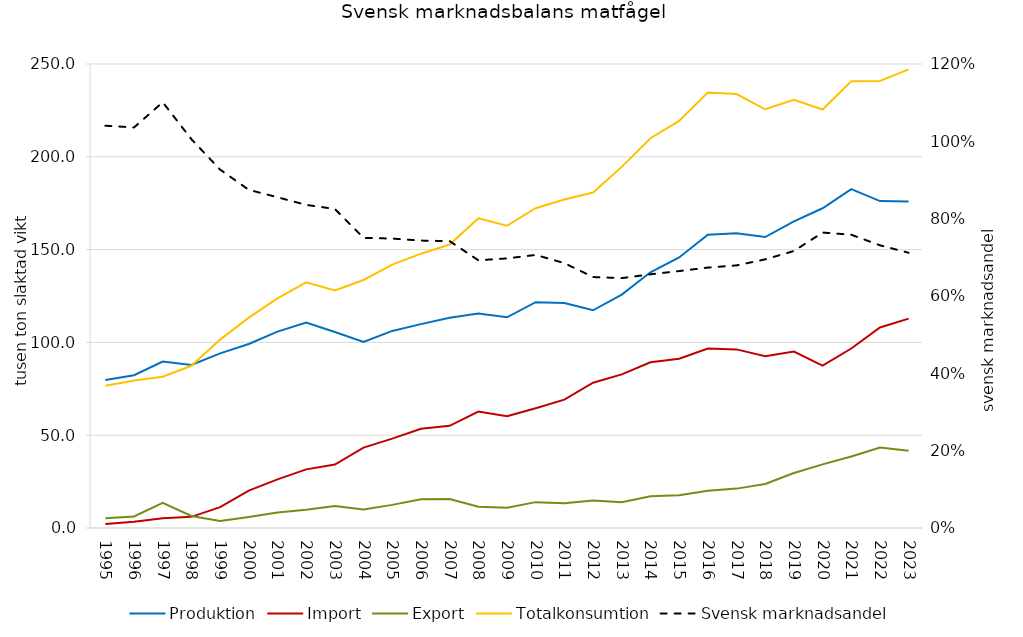
| Category | Produktion | Import | Export | Totalkonsumtion |
|---|---|---|---|---|
| 1995.0 | 79.8 | 2.2 | 5.3 | 76.7 |
| 1996.0 | 82.3 | 3.337 | 6.194 | 79.443 |
| 1997.0 | 89.7 | 5.279 | 13.517 | 81.462 |
| 1998.0 | 87.89 | 6.018 | 6.495 | 87.413 |
| 1999.0 | 94.082 | 11.241 | 3.816 | 101.507 |
| 2000.0 | 99.127 | 20.185 | 5.976 | 113.335 |
| 2001.0 | 105.802 | 26.197 | 8.311 | 123.688 |
| 2002.0 | 110.645 | 31.588 | 9.831 | 132.402 |
| 2003.0 | 105.608 | 34.181 | 11.803 | 127.987 |
| 2004.0 | 100.261 | 43.337 | 9.977 | 133.621 |
| 2005.0 | 106.192 | 48.133 | 12.455 | 141.869 |
| 2006.0 | 109.861 | 53.477 | 15.537 | 147.801 |
| 2007.0 | 113.32 | 55.061 | 15.646 | 152.735 |
| 2008.0 | 115.513 | 62.773 | 11.478 | 166.807 |
| 2009.0 | 113.532 | 60.189 | 10.878 | 162.843 |
| 2010.0 | 121.667 | 64.541 | 13.935 | 172.274 |
| 2011.0 | 121.268 | 69.155 | 13.387 | 177.036 |
| 2012.0 | 117.304 | 78.282 | 14.842 | 180.744 |
| 2013.0 | 125.738 | 82.771 | 13.936 | 194.573 |
| 2014.0 | 137.778 | 89.313 | 17.107 | 209.984 |
| 2015.0 | 145.77 | 91.22 | 17.619 | 219.371 |
| 2016.0 | 158.03 | 96.692 | 20.084 | 234.638 |
| 2017.0 | 158.77 | 96.237 | 21.217 | 233.79 |
| 2018.0 | 156.74 | 92.601 | 23.744 | 225.597 |
| 2019.0 | 165.22 | 95.1 | 29.664 | 230.656 |
| 2020.0 | 172.28 | 87.462 | 34.274 | 225.468 |
| 2021.0 | 182.55 | 96.693 | 38.552 | 240.691 |
| 2022.0 | 176.12 | 108.07 | 43.316 | 240.874 |
| 2023.0 | 175.86 | 112.802 | 41.57 | 247.092 |